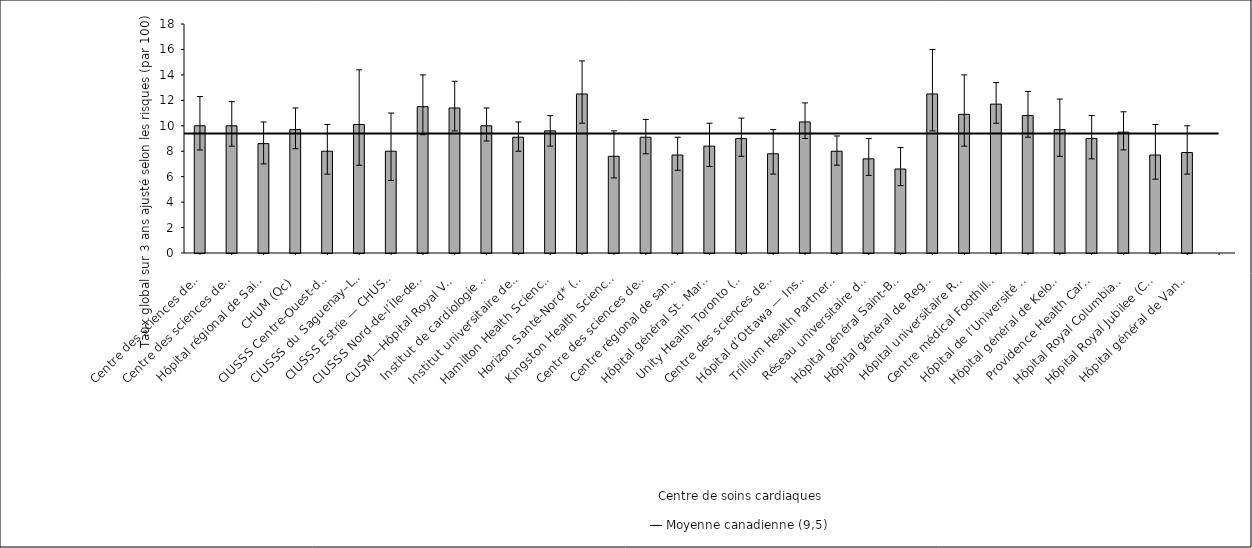
| Category | Taux ajusté selon les risques |
|---|---|
| Centre des sciences de la santé — St. John’s (T. -N.-L.) | 10 |
| Centre des sciences de la santé Queen Elizabeth II (N.-É.) | 10 |
| Hôpital régional de Saint John (N.-B.) | 8.6 |
| CHUM (Qc) | 9.7 |
| CIUSSS Centre-Ouest-de-l’Île-de-Mtl—Hôpital général juif (Qc) | 8 |
| CIUSSS du Saguenay–Lac-St-Jean—Hôpital de Chicoutimi (Qc) | 10.1 |
| CIUSSS Estrie — CHUS—Hôpital Fleurimont (Qc) | 8 |
| CIUSSS Nord-de-l’Île-de-Montréal—Hôpital du Sacré-Coeur de Montréal (Qc) | 11.5 |
| CUSM—Hôpital Royal Victoria* (Qc) | 11.4 |
| Institut de cardiologie de Montréal (Qc) | 10 |
| Institut universitaire de cardiologie et pneumologie de Québec (Qc) | 9.1 |
| Hamilton Health Sciences (Ont.) | 9.6 |
| Horizon Santé-Nord* (Ont.) | 12.5 |
| Kingston Health Sciences Centre (Ont.) | 7.6 |
| Centre des sciences de la santé de London (Ont.) | 9.1 |
| Centre régional de santé Southlake* (Ont.) | 7.7 |
| Hôpital général St. Mary’s (Ont.) | 8.4 |
| Unity Health Toronto (Ont.) | 9 |
| Centre des sciences de la santé Sunnybrook (Ont.) | 7.8 |
| Hôpital d’Ottawa — Institut de cardiologie de l’Université d’Ottawa (Ont.) | 10.3 |
| Trillium Health Partners* (Ont.) | 8 |
| Réseau universitaire de santé* (Ont.) | 7.4 |
| Hôpital général Saint-Boniface* (Man.) | 6.6 |
| Hôpital général de Regina* (Sask.) | 12.5 |
| Hôpital universitaire Royal (Sask.) | 10.9 |
| Centre médical Foothills* (Alb.) | 11.7 |
| Hôpital de l’Université de l’Alberta (Alb.) | 10.8 |
| Hôpital général de Kelowna (C.-B.) | 9.7 |
| Providence Health Care — Hôpital St. Paul’s  (Vancouver) (C.-B.) | 9 |
| Hôpital Royal Columbian (C.-B.) | 9.5 |
| Hôpital Royal Jubilee (C.-B.) | 7.7 |
| Hôpital général de Vancouver (C.-B.) | 7.9 |